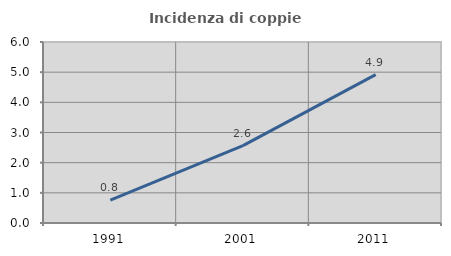
| Category | Incidenza di coppie miste |
|---|---|
| 1991.0 | 0.758 |
| 2001.0 | 2.564 |
| 2011.0 | 4.918 |